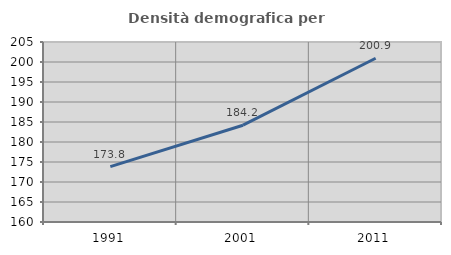
| Category | Densità demografica |
|---|---|
| 1991.0 | 173.832 |
| 2001.0 | 184.197 |
| 2011.0 | 200.936 |